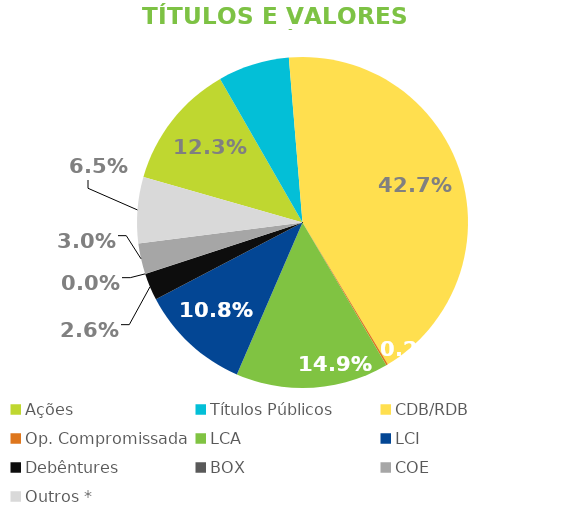
| Category | TVM |
|---|---|
| Ações | 0.123 |
| Títulos Públicos | 0.07 |
| CDB/RDB | 0.427 |
| Op. Compromissada | 0.002 |
| LCA | 0.149 |
| LCI | 0.108 |
| Debêntures | 0.026 |
| BOX | 0 |
| COE | 0.03 |
| Outros * | 0.065 |